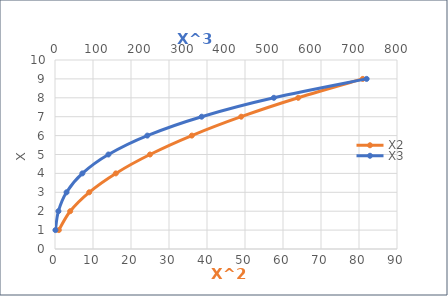
| Category | X2 |
|---|---|
| 1.0 | 1 |
| 4.0 | 2 |
| 9.0 | 3 |
| 16.0 | 4 |
| 25.0 | 5 |
| 36.0 | 6 |
| 49.0 | 7 |
| 64.0 | 8 |
| 81.0 | 9 |